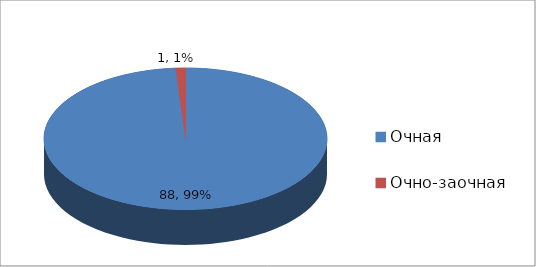
| Category | Series 0 |
|---|---|
| Очная | 88 |
| Очно-заочная | 1 |